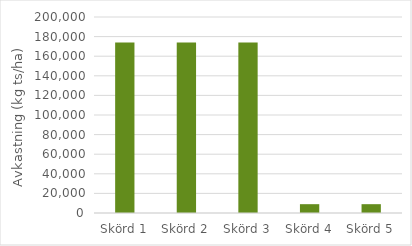
| Category | Series 0 |
|---|---|
| Skörd 1 | 174000 |
| Skörd 2 | 174000 |
| Skörd 3 | 174000 |
| Skörd 4 | 9000 |
| Skörd 5 | 9000 |